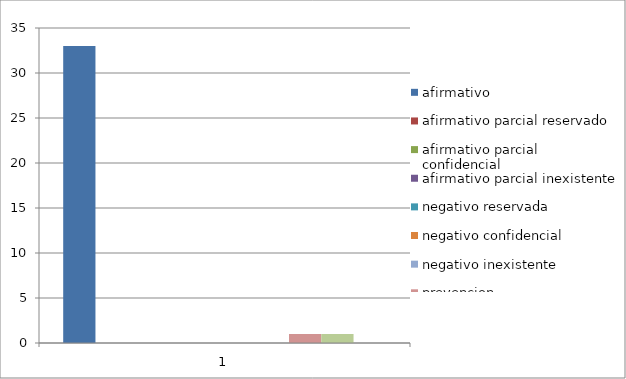
| Category | afirmativo  | afirmativo parcial reservado | afirmativo parcial confidencial  | afirmativo parcial inexistente  | negativo reservada | negativo confidencial | negativo inexistente | prevencion | incompetencia | remitidas al itei - incopetencia  |
|---|---|---|---|---|---|---|---|---|---|---|
| 0 | 33 | 0 | 0 | 0 | 0 | 0 | 0 | 1 | 1 | 0 |